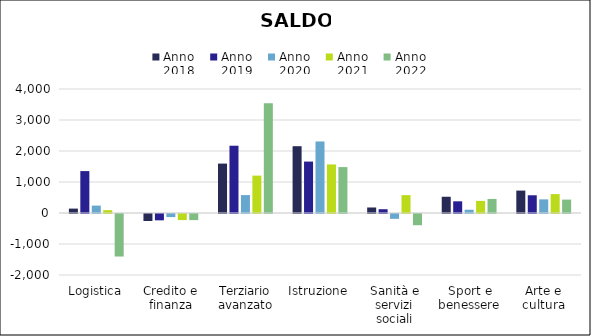
| Category | Anno
2018 | Anno
2019 | Anno
2020 | Anno
2021 | Anno
2022 |
|---|---|---|---|---|---|
| Logistica | 142 | 1352 | 239 | 93 | -1372 |
| Credito e finanza | -225 | -204 | -99 | -196 | -197 |
| Terziario avanzato | 1594 | 2170 | 578 | 1206 | 3539 |
| Istruzione | 2155 | 1659 | 2308 | 1567 | 1481 |
| Sanità e servizi sociali | 178 | 122 | -156 | 577 | -362 |
| Sport e benessere | 524 | 377 | 105 | 391 | 453 |
| Arte e cultura | 723 | 572 | 440 | 610 | 432 |